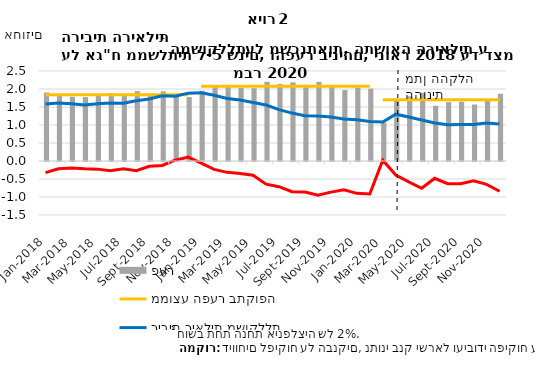
| Category | פער |
|---|---|
| 2018-01-31 | 1.905 |
| 2018-02-28 | 1.825 |
| 2018-03-31 | 1.785 |
| 2018-04-30 | 1.776 |
| 2018-05-31 | 1.815 |
| 2018-06-30 | 1.885 |
| 2018-07-31 | 1.82 |
| 2018-08-31 | 1.939 |
| 2018-09-30 | 1.867 |
| 2018-10-31 | 1.935 |
| 2018-11-30 | 1.779 |
| 2018-12-31 | 1.776 |
| 2019-01-31 | 1.951 |
| 2019-02-28 | 2.059 |
| 2019-03-31 | 2.05 |
| 2019-04-30 | 2.036 |
| 2019-05-31 | 2.022 |
| 2019-06-30 | 2.2 |
| 2019-07-31 | 2.141 |
| 2019-08-31 | 2.186 |
| 2019-09-30 | 2.116 |
| 2019-10-31 | 2.199 |
| 2019-11-30 | 2.087 |
| 2019-12-31 | 1.971 |
| 2020-01-31 | 2.041 |
| 2020-02-29 | 2.01 |
| 2020-03-31 | 1.062 |
| 2020-04-30 | 1.691 |
| 2020-05-31 | 1.798 |
| 2020-06-30 | 1.896 |
| 2020-07-31 | 1.534 |
| 2020-08-31 | 1.636 |
| 2020-09-30 | 1.646 |
| 2020-10-31 | 1.568 |
| 2020-11-30 | 1.706 |
| 2020-12-31 | 1.867 |